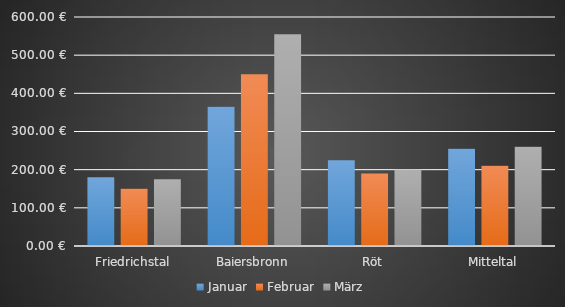
| Category | Januar | Februar | März |
|---|---|---|---|
| Friedrichstal | 180 | 150 | 175 |
| Baiersbronn | 365 | 450 | 555 |
| Röt | 225 | 190 | 200 |
| Mitteltal | 255 | 210 | 260 |